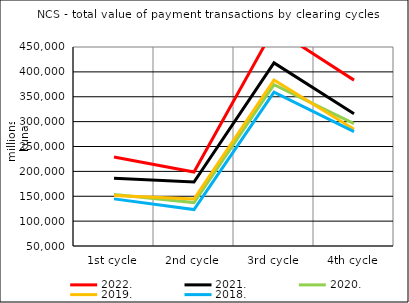
| Category | 2022. | 2021. |
|---|---|---|
| 0 | 228722.83 | 186225.772 |
| 1 | 198631.325 | 178590.8 |
| 2 | 487334.585 | 418085.273 |
| 3 | 383411.199 | 315609.31 |